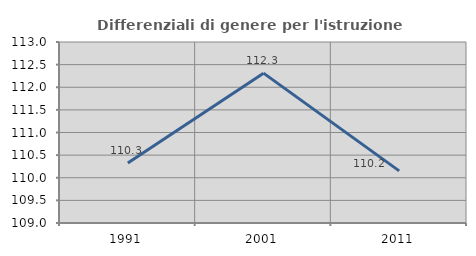
| Category | Differenziali di genere per l'istruzione superiore |
|---|---|
| 1991.0 | 110.324 |
| 2001.0 | 112.312 |
| 2011.0 | 110.152 |